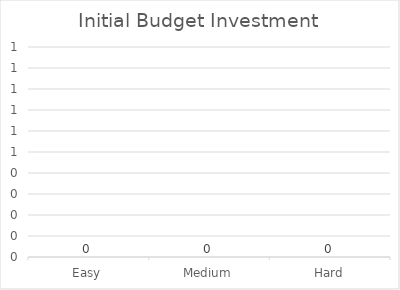
| Category | Series 0 |
|---|---|
| Easy | 0 |
| Medium | 0 |
| Hard | 0 |